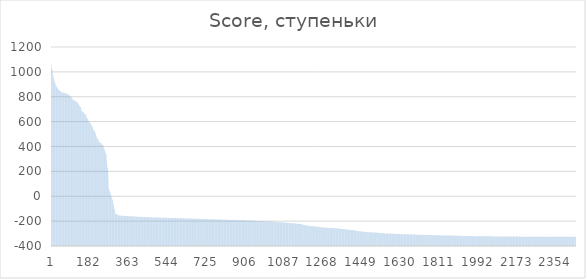
| Category |  Score |
|---|---|
| 0 | 1068.3 |
| 1 | 1045.3 |
| 2 | 1045.3 |
| 3 | 1026 |
| 4 | 1020.4 |
| 5 | 1020.4 |
| 6 | 1016.7 |
| 7 | 1001.3 |
| 8 | 986.9 |
| 9 | 974.9 |
| 10 | 965.9 |
| 11 | 957.7 |
| 12 | 957.7 |
| 13 | 949 |
| 14 | 931.8 |
| 15 | 927.2 |
| 16 | 925.5 |
| 17 | 909.9 |
| 18 | 908.4 |
| 19 | 908.4 |
| 20 | 903.9 |
| 21 | 903.8 |
| 22 | 899.3 |
| 23 | 888.8 |
| 24 | 886 |
| 25 | 884.8 |
| 26 | 874.8 |
| 27 | 874.4 |
| 28 | 874.4 |
| 29 | 874.4 |
| 30 | 867.5 |
| 31 | 865.5 |
| 32 | 864.5 |
| 33 | 858.4 |
| 34 | 856.1 |
| 35 | 856.1 |
| 36 | 856.1 |
| 37 | 854.4 |
| 38 | 851.7 |
| 39 | 849.9 |
| 40 | 848 |
| 41 | 846.7 |
| 42 | 846.1 |
| 43 | 842.8 |
| 44 | 842.8 |
| 45 | 841.3 |
| 46 | 840.3 |
| 47 | 839 |
| 48 | 838.7 |
| 49 | 835.5 |
| 50 | 835.1 |
| 51 | 834.8 |
| 52 | 834.8 |
| 53 | 834 |
| 54 | 833.8 |
| 55 | 833.4 |
| 56 | 832.3 |
| 57 | 832.2 |
| 58 | 832 |
| 59 | 831.9 |
| 60 | 831.8 |
| 61 | 831.1 |
| 62 | 831.1 |
| 63 | 830.5 |
| 64 | 830.1 |
| 65 | 828.3 |
| 66 | 827.8 |
| 67 | 827.5 |
| 68 | 827.5 |
| 69 | 827.5 |
| 70 | 826.8 |
| 71 | 826.2 |
| 72 | 824.3 |
| 73 | 824.3 |
| 74 | 824.3 |
| 75 | 824.2 |
| 76 | 823.1 |
| 77 | 823.1 |
| 78 | 822.6 |
| 79 | 822.6 |
| 80 | 817.3 |
| 81 | 815.6 |
| 82 | 813.9 |
| 83 | 811 |
| 84 | 809.6 |
| 85 | 809.6 |
| 86 | 809.4 |
| 87 | 808.7 |
| 88 | 808.4 |
| 89 | 807.5 |
| 90 | 801.5 |
| 91 | 801.4 |
| 92 | 800.5 |
| 93 | 799.6 |
| 94 | 799.3 |
| 95 | 792.3 |
| 96 | 789.1 |
| 97 | 788.7 |
| 98 | 788.1 |
| 99 | 787.9 |
| 100 | 781.3 |
| 101 | 778 |
| 102 | 776.6 |
| 103 | 776.1 |
| 104 | 774.8 |
| 105 | 774.8 |
| 106 | 774.6 |
| 107 | 772.9 |
| 108 | 770.9 |
| 109 | 770.6 |
| 110 | 769.1 |
| 111 | 767.1 |
| 112 | 766.6 |
| 113 | 766.2 |
| 114 | 765.6 |
| 115 | 763.9 |
| 116 | 760.4 |
| 117 | 759.1 |
| 118 | 758.9 |
| 119 | 758.2 |
| 120 | 758.2 |
| 121 | 757.2 |
| 122 | 754.2 |
| 123 | 754.1 |
| 124 | 748.7 |
| 125 | 748.7 |
| 126 | 746.5 |
| 127 | 745.4 |
| 128 | 744.2 |
| 129 | 740.5 |
| 130 | 736.4 |
| 131 | 730 |
| 132 | 724.7 |
| 133 | 723.2 |
| 134 | 722.5 |
| 135 | 717.6 |
| 136 | 717.4 |
| 137 | 717.3 |
| 138 | 714.9 |
| 139 | 705.1 |
| 140 | 705.1 |
| 141 | 693.6 |
| 142 | 684.6 |
| 143 | 684.6 |
| 144 | 684.6 |
| 145 | 678.8 |
| 146 | 678.8 |
| 147 | 677.8 |
| 148 | 676.9 |
| 149 | 676.3 |
| 150 | 676.2 |
| 151 | 672.1 |
| 152 | 671.6 |
| 153 | 668.4 |
| 154 | 666.9 |
| 155 | 666.9 |
| 156 | 663.7 |
| 157 | 662.2 |
| 158 | 662.2 |
| 159 | 659.4 |
| 160 | 658 |
| 161 | 655.8 |
| 162 | 654.9 |
| 163 | 654.3 |
| 164 | 650 |
| 165 | 635.3 |
| 166 | 631.5 |
| 167 | 630.8 |
| 168 | 630.2 |
| 169 | 626.3 |
| 170 | 623.8 |
| 171 | 622 |
| 172 | 618.1 |
| 173 | 615.3 |
| 174 | 605.3 |
| 175 | 605.3 |
| 176 | 604.8 |
| 177 | 599.4 |
| 178 | 596.2 |
| 179 | 591.2 |
| 180 | 589.1 |
| 181 | 586.8 |
| 182 | 586.4 |
| 183 | 586.4 |
| 184 | 585.6 |
| 185 | 585 |
| 186 | 583.6 |
| 187 | 576.3 |
| 188 | 572.5 |
| 189 | 569.1 |
| 190 | 564.5 |
| 191 | 558.9 |
| 192 | 558.7 |
| 193 | 557.1 |
| 194 | 556 |
| 195 | 547 |
| 196 | 536.5 |
| 197 | 535.8 |
| 198 | 535.8 |
| 199 | 533.5 |
| 200 | 532.5 |
| 201 | 530.9 |
| 202 | 526.7 |
| 203 | 520.2 |
| 204 | 518.5 |
| 205 | 515.1 |
| 206 | 510.4 |
| 207 | 508.6 |
| 208 | 501.3 |
| 209 | 493.6 |
| 210 | 488.4 |
| 211 | 487.8 |
| 212 | 472.9 |
| 213 | 471.2 |
| 214 | 470.2 |
| 215 | 467.7 |
| 216 | 467.5 |
| 217 | 463.9 |
| 218 | 458.5 |
| 219 | 457.2 |
| 220 | 456.5 |
| 221 | 447.6 |
| 222 | 444.8 |
| 223 | 442.6 |
| 224 | 437.9 |
| 225 | 435.9 |
| 226 | 431.6 |
| 227 | 431 |
| 228 | 429.2 |
| 229 | 428.9 |
| 230 | 428.5 |
| 231 | 428 |
| 232 | 426.7 |
| 233 | 426.7 |
| 234 | 425.7 |
| 235 | 424.5 |
| 236 | 422.2 |
| 237 | 417.8 |
| 238 | 415.2 |
| 239 | 412.7 |
| 240 | 411.6 |
| 241 | 411.2 |
| 242 | 411.2 |
| 243 | 410 |
| 244 | 396.2 |
| 245 | 391.4 |
| 246 | 388.6 |
| 247 | 382.4 |
| 248 | 382.4 |
| 249 | 379.2 |
| 250 | 367.2 |
| 251 | 364.5 |
| 252 | 362.6 |
| 253 | 361.1 |
| 254 | 342.3 |
| 255 | 340.5 |
| 256 | 339.1 |
| 257 | 338.4 |
| 258 | 337.6 |
| 259 | 289.9 |
| 260 | 276.2 |
| 261 | 241.1 |
| 262 | 240.1 |
| 263 | 227.3 |
| 264 | 223.8 |
| 265 | 215.9 |
| 266 | 196.5 |
| 267 | 140.6 |
| 268 | 83.1 |
| 269 | 64.9 |
| 270 | 58.5 |
| 271 | 46.3 |
| 272 | 44.8 |
| 273 | 41.5 |
| 274 | 35.5 |
| 275 | 30 |
| 276 | 28.7 |
| 277 | 21.6 |
| 278 | 7.8 |
| 279 | 4.1 |
| 280 | 4.1 |
| 281 | -1 |
| 282 | -8.5 |
| 283 | -9.8 |
| 284 | -20.5 |
| 285 | -21.8 |
| 286 | -29.4 |
| 287 | -35.5 |
| 288 | -38.3 |
| 289 | -42.9 |
| 290 | -56.4 |
| 291 | -63.3 |
| 292 | -76.3 |
| 293 | -83.2 |
| 294 | -95.1 |
| 295 | -104.9 |
| 296 | -106.8 |
| 297 | -107.3 |
| 298 | -136 |
| 299 | -136 |
| 300 | -136.1 |
| 301 | -139.2 |
| 302 | -139.3 |
| 303 | -142.1 |
| 304 | -142.5 |
| 305 | -142.7 |
| 306 | -144.9 |
| 307 | -146.6 |
| 308 | -146.7 |
| 309 | -148 |
| 310 | -149.9 |
| 311 | -149.9 |
| 312 | -150.3 |
| 313 | -150.7 |
| 314 | -153.1 |
| 315 | -153.8 |
| 316 | -153.8 |
| 317 | -154.1 |
| 318 | -154.3 |
| 319 | -154.3 |
| 320 | -155 |
| 321 | -155.1 |
| 322 | -156.1 |
| 323 | -156.2 |
| 324 | -156.2 |
| 325 | -156.2 |
| 326 | -156.2 |
| 327 | -156.2 |
| 328 | -156.4 |
| 329 | -156.4 |
| 330 | -156.4 |
| 331 | -156.6 |
| 332 | -157.1 |
| 333 | -157.1 |
| 334 | -157.1 |
| 335 | -157.6 |
| 336 | -157.7 |
| 337 | -157.7 |
| 338 | -157.8 |
| 339 | -157.8 |
| 340 | -158.1 |
| 341 | -158.1 |
| 342 | -158.1 |
| 343 | -158.1 |
| 344 | -158.1 |
| 345 | -158.2 |
| 346 | -158.3 |
| 347 | -158.4 |
| 348 | -158.7 |
| 349 | -158.8 |
| 350 | -158.9 |
| 351 | -159.2 |
| 352 | -159.4 |
| 353 | -159.4 |
| 354 | -159.7 |
| 355 | -159.7 |
| 356 | -159.7 |
| 357 | -159.7 |
| 358 | -159.7 |
| 359 | -159.8 |
| 360 | -159.8 |
| 361 | -159.9 |
| 362 | -160 |
| 363 | -160.2 |
| 364 | -160.3 |
| 365 | -160.9 |
| 366 | -161.1 |
| 367 | -161.1 |
| 368 | -161.1 |
| 369 | -161.1 |
| 370 | -161.3 |
| 371 | -161.3 |
| 372 | -161.3 |
| 373 | -161.4 |
| 374 | -161.5 |
| 375 | -161.5 |
| 376 | -161.7 |
| 377 | -161.9 |
| 378 | -162 |
| 379 | -162.3 |
| 380 | -162.3 |
| 381 | -162.4 |
| 382 | -162.8 |
| 383 | -162.8 |
| 384 | -162.9 |
| 385 | -163 |
| 386 | -163.2 |
| 387 | -163.3 |
| 388 | -163.4 |
| 389 | -163.4 |
| 390 | -163.5 |
| 391 | -163.5 |
| 392 | -163.5 |
| 393 | -163.6 |
| 394 | -163.6 |
| 395 | -163.7 |
| 396 | -164 |
| 397 | -164 |
| 398 | -164 |
| 399 | -164.1 |
| 400 | -164.1 |
| 401 | -164.1 |
| 402 | -164.1 |
| 403 | -164.2 |
| 404 | -164.2 |
| 405 | -164.5 |
| 406 | -164.5 |
| 407 | -164.6 |
| 408 | -164.7 |
| 409 | -164.9 |
| 410 | -164.9 |
| 411 | -165 |
| 412 | -165 |
| 413 | -165 |
| 414 | -165.1 |
| 415 | -165.2 |
| 416 | -165.2 |
| 417 | -165.2 |
| 418 | -165.3 |
| 419 | -165.3 |
| 420 | -165.3 |
| 421 | -165.4 |
| 422 | -165.5 |
| 423 | -165.6 |
| 424 | -165.9 |
| 425 | -165.9 |
| 426 | -165.9 |
| 427 | -166 |
| 428 | -166.2 |
| 429 | -166.2 |
| 430 | -166.3 |
| 431 | -166.3 |
| 432 | -166.3 |
| 433 | -166.3 |
| 434 | -166.4 |
| 435 | -166.4 |
| 436 | -166.4 |
| 437 | -166.5 |
| 438 | -166.5 |
| 439 | -166.5 |
| 440 | -166.5 |
| 441 | -166.5 |
| 442 | -166.5 |
| 443 | -166.5 |
| 444 | -166.5 |
| 445 | -166.6 |
| 446 | -166.6 |
| 447 | -166.8 |
| 448 | -166.8 |
| 449 | -167 |
| 450 | -167 |
| 451 | -167.1 |
| 452 | -167.1 |
| 453 | -167.2 |
| 454 | -167.2 |
| 455 | -167.2 |
| 456 | -167.7 |
| 457 | -167.7 |
| 458 | -168 |
| 459 | -168.1 |
| 460 | -168.2 |
| 461 | -168.3 |
| 462 | -168.3 |
| 463 | -168.5 |
| 464 | -168.7 |
| 465 | -168.8 |
| 466 | -168.9 |
| 467 | -168.9 |
| 468 | -169.3 |
| 469 | -169.4 |
| 470 | -169.7 |
| 471 | -169.7 |
| 472 | -169.7 |
| 473 | -169.9 |
| 474 | -169.9 |
| 475 | -170.1 |
| 476 | -170.1 |
| 477 | -170.2 |
| 478 | -170.2 |
| 479 | -170.4 |
| 480 | -170.4 |
| 481 | -170.4 |
| 482 | -170.5 |
| 483 | -170.5 |
| 484 | -170.5 |
| 485 | -170.6 |
| 486 | -170.9 |
| 487 | -170.9 |
| 488 | -171.1 |
| 489 | -171.1 |
| 490 | -171.1 |
| 491 | -171.2 |
| 492 | -171.2 |
| 493 | -171.3 |
| 494 | -171.3 |
| 495 | -171.3 |
| 496 | -171.4 |
| 497 | -171.5 |
| 498 | -171.5 |
| 499 | -171.5 |
| 500 | -171.6 |
| 501 | -171.7 |
| 502 | -171.9 |
| 503 | -171.9 |
| 504 | -172 |
| 505 | -172.1 |
| 506 | -172.2 |
| 507 | -172.3 |
| 508 | -172.3 |
| 509 | -172.3 |
| 510 | -172.3 |
| 511 | -172.4 |
| 512 | -172.4 |
| 513 | -172.5 |
| 514 | -172.5 |
| 515 | -172.6 |
| 516 | -172.6 |
| 517 | -172.7 |
| 518 | -172.8 |
| 519 | -172.8 |
| 520 | -172.8 |
| 521 | -172.9 |
| 522 | -172.9 |
| 523 | -172.9 |
| 524 | -173 |
| 525 | -173 |
| 526 | -173 |
| 527 | -173 |
| 528 | -173.2 |
| 529 | -173.3 |
| 530 | -173.3 |
| 531 | -173.4 |
| 532 | -173.4 |
| 533 | -173.5 |
| 534 | -173.5 |
| 535 | -173.5 |
| 536 | -173.5 |
| 537 | -173.6 |
| 538 | -173.6 |
| 539 | -173.6 |
| 540 | -173.7 |
| 541 | -173.7 |
| 542 | -173.9 |
| 543 | -174 |
| 544 | -174.1 |
| 545 | -174.1 |
| 546 | -174.1 |
| 547 | -174.2 |
| 548 | -174.3 |
| 549 | -174.3 |
| 550 | -174.3 |
| 551 | -174.4 |
| 552 | -174.4 |
| 553 | -174.4 |
| 554 | -174.4 |
| 555 | -174.5 |
| 556 | -174.5 |
| 557 | -174.5 |
| 558 | -174.5 |
| 559 | -174.6 |
| 560 | -174.6 |
| 561 | -174.8 |
| 562 | -174.8 |
| 563 | -174.8 |
| 564 | -174.8 |
| 565 | -174.9 |
| 566 | -175 |
| 567 | -175 |
| 568 | -175 |
| 569 | -175 |
| 570 | -175 |
| 571 | -175.1 |
| 572 | -175.3 |
| 573 | -175.3 |
| 574 | -175.4 |
| 575 | -175.4 |
| 576 | -175.4 |
| 577 | -175.4 |
| 578 | -175.5 |
| 579 | -175.5 |
| 580 | -175.5 |
| 581 | -175.5 |
| 582 | -175.5 |
| 583 | -175.5 |
| 584 | -175.5 |
| 585 | -175.5 |
| 586 | -175.5 |
| 587 | -175.5 |
| 588 | -175.6 |
| 589 | -175.6 |
| 590 | -175.7 |
| 591 | -175.7 |
| 592 | -175.7 |
| 593 | -175.7 |
| 594 | -175.8 |
| 595 | -175.9 |
| 596 | -175.9 |
| 597 | -176 |
| 598 | -176.2 |
| 599 | -176.3 |
| 600 | -176.3 |
| 601 | -176.4 |
| 602 | -176.4 |
| 603 | -176.5 |
| 604 | -176.6 |
| 605 | -176.7 |
| 606 | -176.7 |
| 607 | -176.7 |
| 608 | -176.7 |
| 609 | -176.8 |
| 610 | -176.9 |
| 611 | -176.9 |
| 612 | -176.9 |
| 613 | -177 |
| 614 | -177.1 |
| 615 | -177.1 |
| 616 | -177.2 |
| 617 | -177.3 |
| 618 | -177.4 |
| 619 | -177.7 |
| 620 | -177.7 |
| 621 | -177.8 |
| 622 | -177.8 |
| 623 | -177.8 |
| 624 | -177.9 |
| 625 | -177.9 |
| 626 | -177.9 |
| 627 | -177.9 |
| 628 | -178 |
| 629 | -178.1 |
| 630 | -178.1 |
| 631 | -178.1 |
| 632 | -178.1 |
| 633 | -178.1 |
| 634 | -178.4 |
| 635 | -178.5 |
| 636 | -178.6 |
| 637 | -178.7 |
| 638 | -178.7 |
| 639 | -178.8 |
| 640 | -178.8 |
| 641 | -178.8 |
| 642 | -178.9 |
| 643 | -179 |
| 644 | -179 |
| 645 | -179 |
| 646 | -179.2 |
| 647 | -179.4 |
| 648 | -179.5 |
| 649 | -179.5 |
| 650 | -179.6 |
| 651 | -179.6 |
| 652 | -179.6 |
| 653 | -179.6 |
| 654 | -179.6 |
| 655 | -179.6 |
| 656 | -179.7 |
| 657 | -179.8 |
| 658 | -179.9 |
| 659 | -179.9 |
| 660 | -179.9 |
| 661 | -180.1 |
| 662 | -180.1 |
| 663 | -180.1 |
| 664 | -180.3 |
| 665 | -180.3 |
| 666 | -180.5 |
| 667 | -180.5 |
| 668 | -180.5 |
| 669 | -180.6 |
| 670 | -180.6 |
| 671 | -180.6 |
| 672 | -180.6 |
| 673 | -180.7 |
| 674 | -180.8 |
| 675 | -180.9 |
| 676 | -180.9 |
| 677 | -181 |
| 678 | -181 |
| 679 | -181.1 |
| 680 | -181.1 |
| 681 | -181.2 |
| 682 | -181.2 |
| 683 | -181.3 |
| 684 | -181.3 |
| 685 | -181.4 |
| 686 | -181.4 |
| 687 | -181.4 |
| 688 | -181.4 |
| 689 | -181.4 |
| 690 | -181.5 |
| 691 | -181.5 |
| 692 | -181.6 |
| 693 | -181.8 |
| 694 | -182 |
| 695 | -182.1 |
| 696 | -182.1 |
| 697 | -182.1 |
| 698 | -182.2 |
| 699 | -182.3 |
| 700 | -182.3 |
| 701 | -182.4 |
| 702 | -182.4 |
| 703 | -182.5 |
| 704 | -182.6 |
| 705 | -182.7 |
| 706 | -182.7 |
| 707 | -182.8 |
| 708 | -183 |
| 709 | -183 |
| 710 | -183 |
| 711 | -183.2 |
| 712 | -183.2 |
| 713 | -183.4 |
| 714 | -183.4 |
| 715 | -183.4 |
| 716 | -183.4 |
| 717 | -183.4 |
| 718 | -183.4 |
| 719 | -183.4 |
| 720 | -183.5 |
| 721 | -183.5 |
| 722 | -183.6 |
| 723 | -183.8 |
| 724 | -183.8 |
| 725 | -183.9 |
| 726 | -184 |
| 727 | -184.2 |
| 728 | -184.2 |
| 729 | -184.2 |
| 730 | -184.2 |
| 731 | -184.2 |
| 732 | -184.2 |
| 733 | -184.3 |
| 734 | -184.4 |
| 735 | -184.4 |
| 736 | -184.4 |
| 737 | -184.4 |
| 738 | -184.4 |
| 739 | -184.4 |
| 740 | -184.6 |
| 741 | -184.6 |
| 742 | -184.7 |
| 743 | -184.7 |
| 744 | -184.8 |
| 745 | -184.8 |
| 746 | -184.9 |
| 747 | -184.9 |
| 748 | -184.9 |
| 749 | -184.9 |
| 750 | -185.1 |
| 751 | -185.1 |
| 752 | -185.1 |
| 753 | -185.2 |
| 754 | -185.4 |
| 755 | -185.6 |
| 756 | -185.6 |
| 757 | -185.6 |
| 758 | -185.7 |
| 759 | -185.7 |
| 760 | -185.7 |
| 761 | -185.7 |
| 762 | -185.7 |
| 763 | -186.1 |
| 764 | -186.1 |
| 765 | -186.2 |
| 766 | -186.2 |
| 767 | -186.3 |
| 768 | -186.3 |
| 769 | -186.4 |
| 770 | -186.4 |
| 771 | -186.4 |
| 772 | -186.6 |
| 773 | -186.7 |
| 774 | -186.8 |
| 775 | -186.8 |
| 776 | -186.8 |
| 777 | -186.8 |
| 778 | -186.8 |
| 779 | -186.8 |
| 780 | -186.8 |
| 781 | -186.9 |
| 782 | -187 |
| 783 | -187.2 |
| 784 | -187.2 |
| 785 | -187.2 |
| 786 | -187.3 |
| 787 | -187.3 |
| 788 | -187.4 |
| 789 | -187.4 |
| 790 | -187.6 |
| 791 | -187.7 |
| 792 | -187.9 |
| 793 | -187.9 |
| 794 | -188.3 |
| 795 | -188.3 |
| 796 | -188.3 |
| 797 | -188.4 |
| 798 | -188.4 |
| 799 | -188.4 |
| 800 | -188.5 |
| 801 | -188.5 |
| 802 | -188.5 |
| 803 | -188.5 |
| 804 | -188.5 |
| 805 | -188.7 |
| 806 | -188.7 |
| 807 | -188.7 |
| 808 | -188.7 |
| 809 | -188.8 |
| 810 | -189 |
| 811 | -189 |
| 812 | -189 |
| 813 | -189.2 |
| 814 | -189.2 |
| 815 | -189.2 |
| 816 | -189.4 |
| 817 | -189.5 |
| 818 | -189.5 |
| 819 | -189.6 |
| 820 | -189.8 |
| 821 | -189.9 |
| 822 | -189.9 |
| 823 | -189.9 |
| 824 | -189.9 |
| 825 | -190.1 |
| 826 | -190.1 |
| 827 | -190.2 |
| 828 | -190.2 |
| 829 | -190.2 |
| 830 | -190.2 |
| 831 | -190.3 |
| 832 | -190.3 |
| 833 | -190.3 |
| 834 | -190.3 |
| 835 | -190.4 |
| 836 | -190.4 |
| 837 | -190.5 |
| 838 | -190.6 |
| 839 | -190.6 |
| 840 | -190.6 |
| 841 | -190.7 |
| 842 | -190.7 |
| 843 | -190.9 |
| 844 | -190.9 |
| 845 | -190.9 |
| 846 | -191 |
| 847 | -191.1 |
| 848 | -191.2 |
| 849 | -191.2 |
| 850 | -191.5 |
| 851 | -191.5 |
| 852 | -191.6 |
| 853 | -191.6 |
| 854 | -191.7 |
| 855 | -191.7 |
| 856 | -191.7 |
| 857 | -191.8 |
| 858 | -191.8 |
| 859 | -191.8 |
| 860 | -191.8 |
| 861 | -191.8 |
| 862 | -192.1 |
| 863 | -192.1 |
| 864 | -192.1 |
| 865 | -192.1 |
| 866 | -192.1 |
| 867 | -192.1 |
| 868 | -192.2 |
| 869 | -192.2 |
| 870 | -192.3 |
| 871 | -192.3 |
| 872 | -192.3 |
| 873 | -192.4 |
| 874 | -192.4 |
| 875 | -192.5 |
| 876 | -192.6 |
| 877 | -192.6 |
| 878 | -192.8 |
| 879 | -192.9 |
| 880 | -192.9 |
| 881 | -192.9 |
| 882 | -192.9 |
| 883 | -193 |
| 884 | -193.1 |
| 885 | -193.1 |
| 886 | -193.1 |
| 887 | -193.2 |
| 888 | -193.2 |
| 889 | -193.3 |
| 890 | -193.3 |
| 891 | -193.5 |
| 892 | -193.5 |
| 893 | -193.5 |
| 894 | -193.5 |
| 895 | -193.5 |
| 896 | -193.6 |
| 897 | -193.7 |
| 898 | -193.7 |
| 899 | -193.7 |
| 900 | -193.8 |
| 901 | -193.8 |
| 902 | -193.8 |
| 903 | -193.8 |
| 904 | -193.8 |
| 905 | -193.8 |
| 906 | -194 |
| 907 | -194 |
| 908 | -194.1 |
| 909 | -194.1 |
| 910 | -194.1 |
| 911 | -194.1 |
| 912 | -194.2 |
| 913 | -194.2 |
| 914 | -194.4 |
| 915 | -194.4 |
| 916 | -194.4 |
| 917 | -194.5 |
| 918 | -194.5 |
| 919 | -194.7 |
| 920 | -194.8 |
| 921 | -195 |
| 922 | -195.2 |
| 923 | -195.2 |
| 924 | -195.2 |
| 925 | -195.3 |
| 926 | -195.4 |
| 927 | -195.4 |
| 928 | -195.4 |
| 929 | -195.5 |
| 930 | -195.6 |
| 931 | -195.6 |
| 932 | -195.6 |
| 933 | -195.7 |
| 934 | -195.8 |
| 935 | -196 |
| 936 | -196.2 |
| 937 | -196.4 |
| 938 | -196.4 |
| 939 | -196.5 |
| 940 | -196.6 |
| 941 | -196.6 |
| 942 | -196.7 |
| 943 | -196.7 |
| 944 | -196.8 |
| 945 | -196.8 |
| 946 | -196.9 |
| 947 | -196.9 |
| 948 | -197 |
| 949 | -197.1 |
| 950 | -197.1 |
| 951 | -197.3 |
| 952 | -197.7 |
| 953 | -197.8 |
| 954 | -197.9 |
| 955 | -198 |
| 956 | -198 |
| 957 | -198.2 |
| 958 | -198.2 |
| 959 | -198.3 |
| 960 | -198.3 |
| 961 | -198.7 |
| 962 | -198.7 |
| 963 | -198.9 |
| 964 | -199 |
| 965 | -199 |
| 966 | -199.2 |
| 967 | -199.3 |
| 968 | -199.3 |
| 969 | -199.4 |
| 970 | -199.5 |
| 971 | -199.5 |
| 972 | -199.7 |
| 973 | -199.8 |
| 974 | -199.9 |
| 975 | -199.9 |
| 976 | -199.9 |
| 977 | -200 |
| 978 | -200 |
| 979 | -200 |
| 980 | -200 |
| 981 | -200 |
| 982 | -200 |
| 983 | -200.1 |
| 984 | -200.2 |
| 985 | -200.2 |
| 986 | -200.5 |
| 987 | -200.5 |
| 988 | -200.6 |
| 989 | -200.7 |
| 990 | -200.7 |
| 991 | -200.8 |
| 992 | -201.3 |
| 993 | -201.5 |
| 994 | -201.8 |
| 995 | -201.8 |
| 996 | -202 |
| 997 | -202.1 |
| 998 | -202.2 |
| 999 | -202.2 |
| 1000 | -202.2 |
| 1001 | -202.2 |
| 1002 | -202.2 |
| 1003 | -202.2 |
| 1004 | -202.2 |
| 1005 | -202.3 |
| 1006 | -202.5 |
| 1007 | -202.7 |
| 1008 | -202.7 |
| 1009 | -202.7 |
| 1010 | -203 |
| 1011 | -203 |
| 1012 | -203 |
| 1013 | -203.1 |
| 1014 | -203.1 |
| 1015 | -203.2 |
| 1016 | -203.2 |
| 1017 | -203.3 |
| 1018 | -203.4 |
| 1019 | -203.4 |
| 1020 | -203.6 |
| 1021 | -203.7 |
| 1022 | -203.9 |
| 1023 | -203.9 |
| 1024 | -203.9 |
| 1025 | -204.2 |
| 1026 | -204.2 |
| 1027 | -204.3 |
| 1028 | -204.4 |
| 1029 | -204.7 |
| 1030 | -204.9 |
| 1031 | -205 |
| 1032 | -205.2 |
| 1033 | -205.3 |
| 1034 | -205.5 |
| 1035 | -205.6 |
| 1036 | -205.6 |
| 1037 | -205.7 |
| 1038 | -205.9 |
| 1039 | -206.2 |
| 1040 | -206.5 |
| 1041 | -206.6 |
| 1042 | -206.8 |
| 1043 | -206.8 |
| 1044 | -206.8 |
| 1045 | -206.8 |
| 1046 | -206.9 |
| 1047 | -207 |
| 1048 | -207 |
| 1049 | -207 |
| 1050 | -207.3 |
| 1051 | -207.3 |
| 1052 | -207.4 |
| 1053 | -207.4 |
| 1054 | -207.6 |
| 1055 | -207.8 |
| 1056 | -207.9 |
| 1057 | -207.9 |
| 1058 | -208 |
| 1059 | -208 |
| 1060 | -208.1 |
| 1061 | -208.2 |
| 1062 | -208.4 |
| 1063 | -208.6 |
| 1064 | -208.9 |
| 1065 | -209 |
| 1066 | -209.1 |
| 1067 | -209.1 |
| 1068 | -209.1 |
| 1069 | -209.1 |
| 1070 | -209.2 |
| 1071 | -209.5 |
| 1072 | -209.5 |
| 1073 | -209.6 |
| 1074 | -209.7 |
| 1075 | -210 |
| 1076 | -210.3 |
| 1077 | -210.4 |
| 1078 | -210.7 |
| 1079 | -210.7 |
| 1080 | -210.8 |
| 1081 | -210.8 |
| 1082 | -210.8 |
| 1083 | -211.3 |
| 1084 | -211.4 |
| 1085 | -211.6 |
| 1086 | -211.6 |
| 1087 | -211.8 |
| 1088 | -212.3 |
| 1089 | -212.9 |
| 1090 | -212.9 |
| 1091 | -213.1 |
| 1092 | -213.2 |
| 1093 | -213.2 |
| 1094 | -213.2 |
| 1095 | -213.2 |
| 1096 | -213.2 |
| 1097 | -213.2 |
| 1098 | -213.4 |
| 1099 | -213.4 |
| 1100 | -213.4 |
| 1101 | -213.4 |
| 1102 | -213.4 |
| 1103 | -214.3 |
| 1104 | -214.3 |
| 1105 | -214.3 |
| 1106 | -214.3 |
| 1107 | -214.3 |
| 1108 | -214.3 |
| 1109 | -214.9 |
| 1110 | -215 |
| 1111 | -215.4 |
| 1112 | -215.4 |
| 1113 | -215.6 |
| 1114 | -216 |
| 1115 | -216.1 |
| 1116 | -216.1 |
| 1117 | -216.3 |
| 1118 | -216.5 |
| 1119 | -216.6 |
| 1120 | -216.6 |
| 1121 | -217 |
| 1122 | -217.1 |
| 1123 | -217.2 |
| 1124 | -217.6 |
| 1125 | -217.7 |
| 1126 | -217.8 |
| 1127 | -217.8 |
| 1128 | -217.9 |
| 1129 | -218 |
| 1130 | -218.1 |
| 1131 | -218.1 |
| 1132 | -218.7 |
| 1133 | -218.7 |
| 1134 | -218.8 |
| 1135 | -218.8 |
| 1136 | -219.2 |
| 1137 | -219.4 |
| 1138 | -219.5 |
| 1139 | -219.5 |
| 1140 | -219.9 |
| 1141 | -220 |
| 1142 | -220.2 |
| 1143 | -220.2 |
| 1144 | -220.4 |
| 1145 | -220.5 |
| 1146 | -220.5 |
| 1147 | -220.7 |
| 1148 | -220.7 |
| 1149 | -220.9 |
| 1150 | -220.9 |
| 1151 | -221.1 |
| 1152 | -221.1 |
| 1153 | -221.2 |
| 1154 | -221.2 |
| 1155 | -221.9 |
| 1156 | -222.1 |
| 1157 | -222.2 |
| 1158 | -222.3 |
| 1159 | -222.5 |
| 1160 | -222.6 |
| 1161 | -222.7 |
| 1162 | -222.8 |
| 1163 | -223.6 |
| 1164 | -223.7 |
| 1165 | -224.4 |
| 1166 | -224.5 |
| 1167 | -225.2 |
| 1168 | -225.2 |
| 1169 | -225.2 |
| 1170 | -227 |
| 1171 | -228.3 |
| 1172 | -228.4 |
| 1173 | -228.7 |
| 1174 | -228.8 |
| 1175 | -229.2 |
| 1176 | -229.6 |
| 1177 | -230 |
| 1178 | -230.9 |
| 1179 | -231 |
| 1180 | -232.1 |
| 1181 | -232.1 |
| 1182 | -232.8 |
| 1183 | -232.9 |
| 1184 | -232.9 |
| 1185 | -233.3 |
| 1186 | -233.4 |
| 1187 | -233.6 |
| 1188 | -234.1 |
| 1189 | -234.9 |
| 1190 | -235 |
| 1191 | -235.3 |
| 1192 | -235.8 |
| 1193 | -236.1 |
| 1194 | -236.5 |
| 1195 | -236.6 |
| 1196 | -236.6 |
| 1197 | -236.7 |
| 1198 | -237 |
| 1199 | -237.1 |
| 1200 | -238 |
| 1201 | -238.4 |
| 1202 | -238.5 |
| 1203 | -238.7 |
| 1204 | -238.8 |
| 1205 | -238.8 |
| 1206 | -238.8 |
| 1207 | -238.8 |
| 1208 | -239 |
| 1209 | -239 |
| 1210 | -240.3 |
| 1211 | -240.4 |
| 1212 | -240.5 |
| 1213 | -240.5 |
| 1214 | -240.7 |
| 1215 | -240.9 |
| 1216 | -240.9 |
| 1217 | -241 |
| 1218 | -241.5 |
| 1219 | -241.8 |
| 1220 | -242.2 |
| 1221 | -242.2 |
| 1222 | -242.2 |
| 1223 | -242.2 |
| 1224 | -242.2 |
| 1225 | -242.6 |
| 1226 | -242.8 |
| 1227 | -242.9 |
| 1228 | -242.9 |
| 1229 | -243 |
| 1230 | -243.3 |
| 1231 | -243.6 |
| 1232 | -243.8 |
| 1233 | -244 |
| 1234 | -244 |
| 1235 | -244 |
| 1236 | -244 |
| 1237 | -244.1 |
| 1238 | -244.2 |
| 1239 | -244.5 |
| 1240 | -245.4 |
| 1241 | -245.8 |
| 1242 | -245.8 |
| 1243 | -245.8 |
| 1244 | -245.9 |
| 1245 | -245.9 |
| 1246 | -246.3 |
| 1247 | -246.5 |
| 1248 | -246.7 |
| 1249 | -246.8 |
| 1250 | -247.1 |
| 1251 | -247.5 |
| 1252 | -247.6 |
| 1253 | -247.6 |
| 1254 | -247.8 |
| 1255 | -247.9 |
| 1256 | -248 |
| 1257 | -248.4 |
| 1258 | -248.4 |
| 1259 | -248.5 |
| 1260 | -248.7 |
| 1261 | -248.8 |
| 1262 | -249.1 |
| 1263 | -249.4 |
| 1264 | -249.5 |
| 1265 | -250.4 |
| 1266 | -250.4 |
| 1267 | -250.4 |
| 1268 | -250.5 |
| 1269 | -250.6 |
| 1270 | -250.7 |
| 1271 | -250.8 |
| 1272 | -250.8 |
| 1273 | -251.6 |
| 1274 | -251.9 |
| 1275 | -251.9 |
| 1276 | -252.2 |
| 1277 | -252.4 |
| 1278 | -252.4 |
| 1279 | -252.5 |
| 1280 | -252.8 |
| 1281 | -252.9 |
| 1282 | -252.9 |
| 1283 | -252.9 |
| 1284 | -252.9 |
| 1285 | -253.2 |
| 1286 | -253.2 |
| 1287 | -253.6 |
| 1288 | -254.2 |
| 1289 | -254.2 |
| 1290 | -254.2 |
| 1291 | -254.2 |
| 1292 | -254.4 |
| 1293 | -254.5 |
| 1294 | -254.5 |
| 1295 | -254.5 |
| 1296 | -254.7 |
| 1297 | -254.8 |
| 1298 | -254.8 |
| 1299 | -254.8 |
| 1300 | -254.8 |
| 1301 | -254.8 |
| 1302 | -254.8 |
| 1303 | -255 |
| 1304 | -255.1 |
| 1305 | -255.2 |
| 1306 | -255.3 |
| 1307 | -255.5 |
| 1308 | -255.5 |
| 1309 | -255.9 |
| 1310 | -256.1 |
| 1311 | -256.1 |
| 1312 | -256.1 |
| 1313 | -256.2 |
| 1314 | -256.5 |
| 1315 | -256.5 |
| 1316 | -256.7 |
| 1317 | -257.3 |
| 1318 | -257.5 |
| 1319 | -257.7 |
| 1320 | -257.9 |
| 1321 | -258.1 |
| 1322 | -258.2 |
| 1323 | -258.5 |
| 1324 | -258.6 |
| 1325 | -258.7 |
| 1326 | -258.8 |
| 1327 | -258.9 |
| 1328 | -258.9 |
| 1329 | -258.9 |
| 1330 | -259 |
| 1331 | -259 |
| 1332 | -259 |
| 1333 | -259 |
| 1334 | -259 |
| 1335 | -259.2 |
| 1336 | -259.3 |
| 1337 | -259.3 |
| 1338 | -259.4 |
| 1339 | -259.4 |
| 1340 | -259.8 |
| 1341 | -259.8 |
| 1342 | -259.8 |
| 1343 | -260 |
| 1344 | -260.3 |
| 1345 | -260.8 |
| 1346 | -260.8 |
| 1347 | -260.8 |
| 1348 | -260.8 |
| 1349 | -260.9 |
| 1350 | -262.4 |
| 1351 | -262.5 |
| 1352 | -262.5 |
| 1353 | -262.8 |
| 1354 | -263 |
| 1355 | -263 |
| 1356 | -263 |
| 1357 | -263 |
| 1358 | -263 |
| 1359 | -263 |
| 1360 | -263 |
| 1361 | -263 |
| 1362 | -263.4 |
| 1363 | -263.4 |
| 1364 | -263.4 |
| 1365 | -263.5 |
| 1366 | -263.8 |
| 1367 | -263.8 |
| 1368 | -264.2 |
| 1369 | -264.6 |
| 1370 | -265.6 |
| 1371 | -265.8 |
| 1372 | -265.9 |
| 1373 | -266.4 |
| 1374 | -266.4 |
| 1375 | -266.4 |
| 1376 | -266.8 |
| 1377 | -267.2 |
| 1378 | -267.3 |
| 1379 | -267.4 |
| 1380 | -268.1 |
| 1381 | -268.5 |
| 1382 | -268.6 |
| 1383 | -268.7 |
| 1384 | -268.9 |
| 1385 | -269.1 |
| 1386 | -269.2 |
| 1387 | -269.3 |
| 1388 | -269.4 |
| 1389 | -270 |
| 1390 | -270.3 |
| 1391 | -270.8 |
| 1392 | -270.9 |
| 1393 | -270.9 |
| 1394 | -270.9 |
| 1395 | -271.1 |
| 1396 | -271.1 |
| 1397 | -271.3 |
| 1398 | -271.5 |
| 1399 | -271.6 |
| 1400 | -271.7 |
| 1401 | -271.7 |
| 1402 | -271.9 |
| 1403 | -272.1 |
| 1404 | -272.1 |
| 1405 | -272.5 |
| 1406 | -272.6 |
| 1407 | -272.8 |
| 1408 | -273.1 |
| 1409 | -273.4 |
| 1410 | -273.5 |
| 1411 | -273.5 |
| 1412 | -274.1 |
| 1413 | -274.1 |
| 1414 | -274.9 |
| 1415 | -275.2 |
| 1416 | -275.6 |
| 1417 | -275.6 |
| 1418 | -275.8 |
| 1419 | -276.1 |
| 1420 | -276.9 |
| 1421 | -277.5 |
| 1422 | -277.5 |
| 1423 | -277.6 |
| 1424 | -277.9 |
| 1425 | -279.3 |
| 1426 | -279.4 |
| 1427 | -279.5 |
| 1428 | -279.6 |
| 1429 | -279.7 |
| 1430 | -280.1 |
| 1431 | -280.4 |
| 1432 | -281 |
| 1433 | -281 |
| 1434 | -281.1 |
| 1435 | -281.2 |
| 1436 | -281.7 |
| 1437 | -281.8 |
| 1438 | -281.9 |
| 1439 | -281.9 |
| 1440 | -282 |
| 1441 | -282.1 |
| 1442 | -282.3 |
| 1443 | -282.4 |
| 1444 | -282.6 |
| 1445 | -283.2 |
| 1446 | -283.4 |
| 1447 | -283.5 |
| 1448 | -283.9 |
| 1449 | -284 |
| 1450 | -284.1 |
| 1451 | -284.3 |
| 1452 | -285 |
| 1453 | -285.1 |
| 1454 | -285.2 |
| 1455 | -285.8 |
| 1456 | -286.1 |
| 1457 | -286.1 |
| 1458 | -286.2 |
| 1459 | -286.3 |
| 1460 | -286.9 |
| 1461 | -287 |
| 1462 | -287 |
| 1463 | -287.1 |
| 1464 | -287.1 |
| 1465 | -287.1 |
| 1466 | -287.1 |
| 1467 | -287.2 |
| 1468 | -287.3 |
| 1469 | -287.3 |
| 1470 | -287.6 |
| 1471 | -287.7 |
| 1472 | -287.8 |
| 1473 | -287.8 |
| 1474 | -288 |
| 1475 | -288.6 |
| 1476 | -288.6 |
| 1477 | -288.6 |
| 1478 | -288.8 |
| 1479 | -288.9 |
| 1480 | -288.9 |
| 1481 | -289 |
| 1482 | -289.1 |
| 1483 | -289.4 |
| 1484 | -289.4 |
| 1485 | -289.4 |
| 1486 | -289.9 |
| 1487 | -289.9 |
| 1488 | -289.9 |
| 1489 | -290 |
| 1490 | -290.1 |
| 1491 | -290.3 |
| 1492 | -290.4 |
| 1493 | -290.5 |
| 1494 | -290.5 |
| 1495 | -290.6 |
| 1496 | -290.6 |
| 1497 | -290.7 |
| 1498 | -290.7 |
| 1499 | -290.8 |
| 1500 | -290.8 |
| 1501 | -290.8 |
| 1502 | -291 |
| 1503 | -291.3 |
| 1504 | -291.3 |
| 1505 | -291.3 |
| 1506 | -291.3 |
| 1507 | -291.4 |
| 1508 | -291.5 |
| 1509 | -291.7 |
| 1510 | -291.8 |
| 1511 | -291.8 |
| 1512 | -292 |
| 1513 | -292 |
| 1514 | -292.1 |
| 1515 | -292.3 |
| 1516 | -292.3 |
| 1517 | -292.7 |
| 1518 | -292.7 |
| 1519 | -292.9 |
| 1520 | -293.1 |
| 1521 | -293.6 |
| 1522 | -293.9 |
| 1523 | -294 |
| 1524 | -294.2 |
| 1525 | -294.8 |
| 1526 | -294.8 |
| 1527 | -295.2 |
| 1528 | -295.3 |
| 1529 | -295.3 |
| 1530 | -295.4 |
| 1531 | -295.4 |
| 1532 | -295.5 |
| 1533 | -295.7 |
| 1534 | -295.8 |
| 1535 | -296 |
| 1536 | -296.2 |
| 1537 | -296.5 |
| 1538 | -296.9 |
| 1539 | -297.2 |
| 1540 | -297.3 |
| 1541 | -297.4 |
| 1542 | -297.4 |
| 1543 | -297.5 |
| 1544 | -297.6 |
| 1545 | -297.6 |
| 1546 | -297.8 |
| 1547 | -297.9 |
| 1548 | -297.9 |
| 1549 | -298 |
| 1550 | -298.4 |
| 1551 | -298.5 |
| 1552 | -298.5 |
| 1553 | -298.6 |
| 1554 | -298.9 |
| 1555 | -299 |
| 1556 | -299 |
| 1557 | -299.1 |
| 1558 | -299.2 |
| 1559 | -299.5 |
| 1560 | -299.5 |
| 1561 | -299.5 |
| 1562 | -299.8 |
| 1563 | -299.8 |
| 1564 | -299.9 |
| 1565 | -300 |
| 1566 | -300.1 |
| 1567 | -300.1 |
| 1568 | -300.2 |
| 1569 | -300.4 |
| 1570 | -300.6 |
| 1571 | -300.7 |
| 1572 | -300.9 |
| 1573 | -301 |
| 1574 | -301.1 |
| 1575 | -301.1 |
| 1576 | -301.3 |
| 1577 | -301.4 |
| 1578 | -301.5 |
| 1579 | -301.5 |
| 1580 | -301.6 |
| 1581 | -301.7 |
| 1582 | -301.7 |
| 1583 | -301.7 |
| 1584 | -301.7 |
| 1585 | -301.8 |
| 1586 | -301.8 |
| 1587 | -301.9 |
| 1588 | -301.9 |
| 1589 | -301.9 |
| 1590 | -301.9 |
| 1591 | -301.9 |
| 1592 | -301.9 |
| 1593 | -301.9 |
| 1594 | -301.9 |
| 1595 | -301.9 |
| 1596 | -302 |
| 1597 | -302 |
| 1598 | -302.1 |
| 1599 | -302.1 |
| 1600 | -302.1 |
| 1601 | -302.2 |
| 1602 | -302.4 |
| 1603 | -302.4 |
| 1604 | -302.5 |
| 1605 | -302.5 |
| 1606 | -302.5 |
| 1607 | -302.6 |
| 1608 | -302.7 |
| 1609 | -302.7 |
| 1610 | -302.8 |
| 1611 | -302.8 |
| 1612 | -302.8 |
| 1613 | -302.8 |
| 1614 | -302.9 |
| 1615 | -302.9 |
| 1616 | -302.9 |
| 1617 | -302.9 |
| 1618 | -303 |
| 1619 | -303 |
| 1620 | -303 |
| 1621 | -303.1 |
| 1622 | -303.4 |
| 1623 | -303.4 |
| 1624 | -303.5 |
| 1625 | -303.5 |
| 1626 | -303.6 |
| 1627 | -304 |
| 1628 | -304 |
| 1629 | -304.1 |
| 1630 | -304.1 |
| 1631 | -304.1 |
| 1632 | -304.2 |
| 1633 | -304.3 |
| 1634 | -304.4 |
| 1635 | -304.5 |
| 1636 | -304.6 |
| 1637 | -304.6 |
| 1638 | -304.6 |
| 1639 | -304.6 |
| 1640 | -304.7 |
| 1641 | -305 |
| 1642 | -305.1 |
| 1643 | -305.1 |
| 1644 | -305.2 |
| 1645 | -305.4 |
| 1646 | -305.4 |
| 1647 | -305.4 |
| 1648 | -305.5 |
| 1649 | -305.5 |
| 1650 | -305.5 |
| 1651 | -305.5 |
| 1652 | -305.5 |
| 1653 | -305.6 |
| 1654 | -305.6 |
| 1655 | -305.6 |
| 1656 | -305.7 |
| 1657 | -305.7 |
| 1658 | -305.7 |
| 1659 | -305.9 |
| 1660 | -305.9 |
| 1661 | -306 |
| 1662 | -306 |
| 1663 | -306 |
| 1664 | -306.2 |
| 1665 | -306.3 |
| 1666 | -306.3 |
| 1667 | -306.3 |
| 1668 | -306.3 |
| 1669 | -306.3 |
| 1670 | -306.4 |
| 1671 | -306.5 |
| 1672 | -306.6 |
| 1673 | -306.7 |
| 1674 | -307 |
| 1675 | -307 |
| 1676 | -307.3 |
| 1677 | -307.4 |
| 1678 | -307.4 |
| 1679 | -307.4 |
| 1680 | -307.5 |
| 1681 | -307.7 |
| 1682 | -307.7 |
| 1683 | -307.7 |
| 1684 | -307.7 |
| 1685 | -307.8 |
| 1686 | -307.8 |
| 1687 | -307.8 |
| 1688 | -307.8 |
| 1689 | -307.8 |
| 1690 | -307.9 |
| 1691 | -307.9 |
| 1692 | -307.9 |
| 1693 | -307.9 |
| 1694 | -308.2 |
| 1695 | -308.2 |
| 1696 | -308.3 |
| 1697 | -308.3 |
| 1698 | -308.4 |
| 1699 | -308.5 |
| 1700 | -308.7 |
| 1701 | -308.8 |
| 1702 | -308.9 |
| 1703 | -309 |
| 1704 | -309.1 |
| 1705 | -309.1 |
| 1706 | -309.3 |
| 1707 | -309.4 |
| 1708 | -309.4 |
| 1709 | -309.4 |
| 1710 | -309.4 |
| 1711 | -309.5 |
| 1712 | -309.5 |
| 1713 | -309.5 |
| 1714 | -309.6 |
| 1715 | -309.7 |
| 1716 | -309.7 |
| 1717 | -309.7 |
| 1718 | -309.7 |
| 1719 | -309.8 |
| 1720 | -309.8 |
| 1721 | -309.9 |
| 1722 | -309.9 |
| 1723 | -310 |
| 1724 | -310 |
| 1725 | -310.1 |
| 1726 | -310.1 |
| 1727 | -310.2 |
| 1728 | -310.2 |
| 1729 | -310.3 |
| 1730 | -310.4 |
| 1731 | -310.5 |
| 1732 | -310.5 |
| 1733 | -310.6 |
| 1734 | -310.6 |
| 1735 | -310.6 |
| 1736 | -310.6 |
| 1737 | -310.6 |
| 1738 | -310.7 |
| 1739 | -310.8 |
| 1740 | -310.9 |
| 1741 | -311 |
| 1742 | -311 |
| 1743 | -311 |
| 1744 | -311.1 |
| 1745 | -311.2 |
| 1746 | -311.3 |
| 1747 | -311.4 |
| 1748 | -311.4 |
| 1749 | -311.5 |
| 1750 | -311.6 |
| 1751 | -311.6 |
| 1752 | -311.6 |
| 1753 | -311.8 |
| 1754 | -311.8 |
| 1755 | -311.9 |
| 1756 | -311.9 |
| 1757 | -311.9 |
| 1758 | -312 |
| 1759 | -312.2 |
| 1760 | -312.2 |
| 1761 | -312.2 |
| 1762 | -312.2 |
| 1763 | -312.3 |
| 1764 | -312.5 |
| 1765 | -312.5 |
| 1766 | -312.5 |
| 1767 | -312.5 |
| 1768 | -312.6 |
| 1769 | -312.6 |
| 1770 | -312.6 |
| 1771 | -312.6 |
| 1772 | -312.8 |
| 1773 | -312.8 |
| 1774 | -312.8 |
| 1775 | -312.9 |
| 1776 | -313 |
| 1777 | -313 |
| 1778 | -313 |
| 1779 | -313 |
| 1780 | -313.1 |
| 1781 | -313.1 |
| 1782 | -313.2 |
| 1783 | -313.2 |
| 1784 | -313.2 |
| 1785 | -313.2 |
| 1786 | -313.2 |
| 1787 | -313.3 |
| 1788 | -313.3 |
| 1789 | -313.3 |
| 1790 | -313.7 |
| 1791 | -313.8 |
| 1792 | -313.8 |
| 1793 | -313.8 |
| 1794 | -313.9 |
| 1795 | -313.9 |
| 1796 | -314 |
| 1797 | -314.1 |
| 1798 | -314.1 |
| 1799 | -314.1 |
| 1800 | -314.1 |
| 1801 | -314.2 |
| 1802 | -314.2 |
| 1803 | -314.2 |
| 1804 | -314.2 |
| 1805 | -314.2 |
| 1806 | -314.3 |
| 1807 | -314.3 |
| 1808 | -314.3 |
| 1809 | -314.4 |
| 1810 | -314.4 |
| 1811 | -314.4 |
| 1812 | -314.4 |
| 1813 | -314.4 |
| 1814 | -314.5 |
| 1815 | -314.5 |
| 1816 | -314.5 |
| 1817 | -314.5 |
| 1818 | -314.6 |
| 1819 | -314.7 |
| 1820 | -314.7 |
| 1821 | -314.7 |
| 1822 | -314.7 |
| 1823 | -314.7 |
| 1824 | -314.7 |
| 1825 | -314.7 |
| 1826 | -314.8 |
| 1827 | -314.9 |
| 1828 | -314.9 |
| 1829 | -314.9 |
| 1830 | -314.9 |
| 1831 | -314.9 |
| 1832 | -315 |
| 1833 | -315.1 |
| 1834 | -315.2 |
| 1835 | -315.2 |
| 1836 | -315.2 |
| 1837 | -315.2 |
| 1838 | -315.2 |
| 1839 | -315.2 |
| 1840 | -315.3 |
| 1841 | -315.4 |
| 1842 | -315.4 |
| 1843 | -315.4 |
| 1844 | -315.6 |
| 1845 | -315.7 |
| 1846 | -315.7 |
| 1847 | -315.7 |
| 1848 | -315.7 |
| 1849 | -315.8 |
| 1850 | -315.9 |
| 1851 | -315.9 |
| 1852 | -316 |
| 1853 | -316 |
| 1854 | -316 |
| 1855 | -316 |
| 1856 | -316 |
| 1857 | -316.1 |
| 1858 | -316.1 |
| 1859 | -316.1 |
| 1860 | -316.1 |
| 1861 | -316.1 |
| 1862 | -316.2 |
| 1863 | -316.2 |
| 1864 | -316.2 |
| 1865 | -316.2 |
| 1866 | -316.2 |
| 1867 | -316.2 |
| 1868 | -316.3 |
| 1869 | -316.3 |
| 1870 | -316.3 |
| 1871 | -316.5 |
| 1872 | -316.5 |
| 1873 | -316.6 |
| 1874 | -316.7 |
| 1875 | -316.9 |
| 1876 | -317 |
| 1877 | -317 |
| 1878 | -317.1 |
| 1879 | -317.1 |
| 1880 | -317.2 |
| 1881 | -317.4 |
| 1882 | -317.5 |
| 1883 | -317.5 |
| 1884 | -317.6 |
| 1885 | -317.6 |
| 1886 | -317.7 |
| 1887 | -317.7 |
| 1888 | -317.7 |
| 1889 | -317.7 |
| 1890 | -317.8 |
| 1891 | -317.8 |
| 1892 | -317.8 |
| 1893 | -317.9 |
| 1894 | -317.9 |
| 1895 | -317.9 |
| 1896 | -317.9 |
| 1897 | -318 |
| 1898 | -318.1 |
| 1899 | -318.2 |
| 1900 | -318.3 |
| 1901 | -318.3 |
| 1902 | -318.3 |
| 1903 | -318.4 |
| 1904 | -318.5 |
| 1905 | -318.5 |
| 1906 | -318.5 |
| 1907 | -318.5 |
| 1908 | -318.5 |
| 1909 | -318.6 |
| 1910 | -318.6 |
| 1911 | -318.8 |
| 1912 | -318.9 |
| 1913 | -318.9 |
| 1914 | -319.1 |
| 1915 | -319.2 |
| 1916 | -319.3 |
| 1917 | -319.3 |
| 1918 | -319.3 |
| 1919 | -319.3 |
| 1920 | -319.4 |
| 1921 | -319.4 |
| 1922 | -319.4 |
| 1923 | -319.5 |
| 1924 | -319.5 |
| 1925 | -319.6 |
| 1926 | -319.6 |
| 1927 | -319.7 |
| 1928 | -319.7 |
| 1929 | -319.7 |
| 1930 | -319.7 |
| 1931 | -319.7 |
| 1932 | -319.7 |
| 1933 | -319.7 |
| 1934 | -319.7 |
| 1935 | -319.9 |
| 1936 | -319.9 |
| 1937 | -319.9 |
| 1938 | -319.9 |
| 1939 | -320 |
| 1940 | -320 |
| 1941 | -320 |
| 1942 | -320 |
| 1943 | -320.1 |
| 1944 | -320.1 |
| 1945 | -320.1 |
| 1946 | -320.1 |
| 1947 | -320.1 |
| 1948 | -320.2 |
| 1949 | -320.2 |
| 1950 | -320.2 |
| 1951 | -320.2 |
| 1952 | -320.3 |
| 1953 | -320.3 |
| 1954 | -320.3 |
| 1955 | -320.3 |
| 1956 | -320.3 |
| 1957 | -320.4 |
| 1958 | -320.4 |
| 1959 | -320.4 |
| 1960 | -320.4 |
| 1961 | -320.4 |
| 1962 | -320.5 |
| 1963 | -320.5 |
| 1964 | -320.5 |
| 1965 | -320.5 |
| 1966 | -320.6 |
| 1967 | -320.6 |
| 1968 | -320.7 |
| 1969 | -320.7 |
| 1970 | -320.7 |
| 1971 | -320.7 |
| 1972 | -320.8 |
| 1973 | -320.9 |
| 1974 | -320.9 |
| 1975 | -320.9 |
| 1976 | -320.9 |
| 1977 | -321 |
| 1978 | -321 |
| 1979 | -321 |
| 1980 | -321 |
| 1981 | -321.1 |
| 1982 | -321.1 |
| 1983 | -321.1 |
| 1984 | -321.1 |
| 1985 | -321.1 |
| 1986 | -321.1 |
| 1987 | -321.1 |
| 1988 | -321.1 |
| 1989 | -321.2 |
| 1990 | -321.2 |
| 1991 | -321.2 |
| 1992 | -321.2 |
| 1993 | -321.3 |
| 1994 | -321.3 |
| 1995 | -321.3 |
| 1996 | -321.3 |
| 1997 | -321.3 |
| 1998 | -321.4 |
| 1999 | -321.4 |
| 2000 | -321.5 |
| 2001 | -321.5 |
| 2002 | -321.5 |
| 2003 | -321.6 |
| 2004 | -321.6 |
| 2005 | -321.6 |
| 2006 | -321.7 |
| 2007 | -321.7 |
| 2008 | -321.7 |
| 2009 | -321.7 |
| 2010 | -321.7 |
| 2011 | -321.7 |
| 2012 | -321.7 |
| 2013 | -321.8 |
| 2014 | -321.8 |
| 2015 | -321.8 |
| 2016 | -321.8 |
| 2017 | -321.8 |
| 2018 | -321.8 |
| 2019 | -321.9 |
| 2020 | -321.9 |
| 2021 | -322 |
| 2022 | -322.1 |
| 2023 | -322.1 |
| 2024 | -322.1 |
| 2025 | -322.2 |
| 2026 | -322.2 |
| 2027 | -322.2 |
| 2028 | -322.2 |
| 2029 | -322.2 |
| 2030 | -322.2 |
| 2031 | -322.2 |
| 2032 | -322.2 |
| 2033 | -322.2 |
| 2034 | -322.2 |
| 2035 | -322.2 |
| 2036 | -322.3 |
| 2037 | -322.3 |
| 2038 | -322.4 |
| 2039 | -322.4 |
| 2040 | -322.4 |
| 2041 | -322.5 |
| 2042 | -322.5 |
| 2043 | -322.5 |
| 2044 | -322.5 |
| 2045 | -322.5 |
| 2046 | -322.5 |
| 2047 | -322.5 |
| 2048 | -322.6 |
| 2049 | -322.6 |
| 2050 | -322.6 |
| 2051 | -322.6 |
| 2052 | -322.6 |
| 2053 | -322.6 |
| 2054 | -322.7 |
| 2055 | -322.7 |
| 2056 | -322.7 |
| 2057 | -322.7 |
| 2058 | -322.7 |
| 2059 | -322.7 |
| 2060 | -322.8 |
| 2061 | -322.8 |
| 2062 | -322.8 |
| 2063 | -322.8 |
| 2064 | -322.9 |
| 2065 | -322.9 |
| 2066 | -322.9 |
| 2067 | -322.9 |
| 2068 | -322.9 |
| 2069 | -323 |
| 2070 | -323 |
| 2071 | -323 |
| 2072 | -323 |
| 2073 | -323 |
| 2074 | -323 |
| 2075 | -323.1 |
| 2076 | -323.1 |
| 2077 | -323.1 |
| 2078 | -323.1 |
| 2079 | -323.1 |
| 2080 | -323.2 |
| 2081 | -323.2 |
| 2082 | -323.2 |
| 2083 | -323.2 |
| 2084 | -323.3 |
| 2085 | -323.3 |
| 2086 | -323.3 |
| 2087 | -323.3 |
| 2088 | -323.3 |
| 2089 | -323.3 |
| 2090 | -323.4 |
| 2091 | -323.4 |
| 2092 | -323.4 |
| 2093 | -323.4 |
| 2094 | -323.4 |
| 2095 | -323.4 |
| 2096 | -323.4 |
| 2097 | -323.5 |
| 2098 | -323.5 |
| 2099 | -323.5 |
| 2100 | -323.5 |
| 2101 | -323.5 |
| 2102 | -323.5 |
| 2103 | -323.5 |
| 2104 | -323.5 |
| 2105 | -323.5 |
| 2106 | -323.5 |
| 2107 | -323.6 |
| 2108 | -323.6 |
| 2109 | -323.6 |
| 2110 | -323.6 |
| 2111 | -323.6 |
| 2112 | -323.6 |
| 2113 | -323.7 |
| 2114 | -323.7 |
| 2115 | -323.7 |
| 2116 | -323.7 |
| 2117 | -323.7 |
| 2118 | -323.8 |
| 2119 | -323.8 |
| 2120 | -323.8 |
| 2121 | -323.8 |
| 2122 | -323.8 |
| 2123 | -323.8 |
| 2124 | -323.8 |
| 2125 | -323.9 |
| 2126 | -323.9 |
| 2127 | -323.9 |
| 2128 | -323.9 |
| 2129 | -323.9 |
| 2130 | -323.9 |
| 2131 | -323.9 |
| 2132 | -323.9 |
| 2133 | -323.9 |
| 2134 | -323.9 |
| 2135 | -324 |
| 2136 | -324 |
| 2137 | -324 |
| 2138 | -324 |
| 2139 | -324 |
| 2140 | -324.1 |
| 2141 | -324.1 |
| 2142 | -324.1 |
| 2143 | -324.1 |
| 2144 | -324.1 |
| 2145 | -324.1 |
| 2146 | -324.1 |
| 2147 | -324.1 |
| 2148 | -324.1 |
| 2149 | -324.2 |
| 2150 | -324.2 |
| 2151 | -324.2 |
| 2152 | -324.2 |
| 2153 | -324.2 |
| 2154 | -324.2 |
| 2155 | -324.3 |
| 2156 | -324.3 |
| 2157 | -324.3 |
| 2158 | -324.4 |
| 2159 | -324.4 |
| 2160 | -324.4 |
| 2161 | -324.4 |
| 2162 | -324.5 |
| 2163 | -324.5 |
| 2164 | -324.5 |
| 2165 | -324.5 |
| 2166 | -324.5 |
| 2167 | -324.6 |
| 2168 | -324.6 |
| 2169 | -324.6 |
| 2170 | -324.6 |
| 2171 | -324.6 |
| 2172 | -324.6 |
| 2173 | -324.6 |
| 2174 | -324.6 |
| 2175 | -324.6 |
| 2176 | -324.6 |
| 2177 | -324.6 |
| 2178 | -324.6 |
| 2179 | -324.6 |
| 2180 | -324.6 |
| 2181 | -324.6 |
| 2182 | -324.6 |
| 2183 | -324.6 |
| 2184 | -324.6 |
| 2185 | -324.6 |
| 2186 | -324.7 |
| 2187 | -324.7 |
| 2188 | -324.7 |
| 2189 | -324.7 |
| 2190 | -324.7 |
| 2191 | -324.7 |
| 2192 | -324.8 |
| 2193 | -324.8 |
| 2194 | -324.8 |
| 2195 | -324.8 |
| 2196 | -324.8 |
| 2197 | -324.8 |
| 2198 | -324.8 |
| 2199 | -324.8 |
| 2200 | -324.8 |
| 2201 | -324.8 |
| 2202 | -324.8 |
| 2203 | -324.9 |
| 2204 | -324.9 |
| 2205 | -324.9 |
| 2206 | -324.9 |
| 2207 | -324.9 |
| 2208 | -324.9 |
| 2209 | -324.9 |
| 2210 | -324.9 |
| 2211 | -324.9 |
| 2212 | -324.9 |
| 2213 | -324.9 |
| 2214 | -324.9 |
| 2215 | -324.9 |
| 2216 | -324.9 |
| 2217 | -324.9 |
| 2218 | -324.9 |
| 2219 | -324.9 |
| 2220 | -324.9 |
| 2221 | -324.9 |
| 2222 | -324.9 |
| 2223 | -324.9 |
| 2224 | -324.9 |
| 2225 | -324.9 |
| 2226 | -324.9 |
| 2227 | -324.9 |
| 2228 | -324.9 |
| 2229 | -324.9 |
| 2230 | -324.9 |
| 2231 | -324.9 |
| 2232 | -324.9 |
| 2233 | -324.9 |
| 2234 | -324.9 |
| 2235 | -324.9 |
| 2236 | -324.9 |
| 2237 | -324.9 |
| 2238 | -324.9 |
| 2239 | -324.9 |
| 2240 | -324.9 |
| 2241 | -324.9 |
| 2242 | -324.9 |
| 2243 | -324.9 |
| 2244 | -324.9 |
| 2245 | -324.9 |
| 2246 | -324.9 |
| 2247 | -324.9 |
| 2248 | -324.9 |
| 2249 | -324.9 |
| 2250 | -324.9 |
| 2251 | -324.9 |
| 2252 | -324.9 |
| 2253 | -324.9 |
| 2254 | -324.9 |
| 2255 | -324.9 |
| 2256 | -324.9 |
| 2257 | -325 |
| 2258 | -325 |
| 2259 | -325 |
| 2260 | -325 |
| 2261 | -325 |
| 2262 | -325 |
| 2263 | -325.1 |
| 2264 | -325.1 |
| 2265 | -325.1 |
| 2266 | -325.1 |
| 2267 | -325.1 |
| 2268 | -325.1 |
| 2269 | -325.1 |
| 2270 | -325.1 |
| 2271 | -325.1 |
| 2272 | -325.1 |
| 2273 | -325.1 |
| 2274 | -325.1 |
| 2275 | -325.1 |
| 2276 | -325.1 |
| 2277 | -325.1 |
| 2278 | -325.1 |
| 2279 | -325.1 |
| 2280 | -325.1 |
| 2281 | -325.1 |
| 2282 | -325.2 |
| 2283 | -325.2 |
| 2284 | -325.2 |
| 2285 | -325.2 |
| 2286 | -325.3 |
| 2287 | -325.3 |
| 2288 | -325.3 |
| 2289 | -325.3 |
| 2290 | -325.3 |
| 2291 | -325.3 |
| 2292 | -325.3 |
| 2293 | -325.3 |
| 2294 | -325.3 |
| 2295 | -325.3 |
| 2296 | -325.3 |
| 2297 | -325.3 |
| 2298 | -325.3 |
| 2299 | -325.3 |
| 2300 | -325.3 |
| 2301 | -325.3 |
| 2302 | -325.3 |
| 2303 | -325.3 |
| 2304 | -325.3 |
| 2305 | -325.3 |
| 2306 | -325.3 |
| 2307 | -325.3 |
| 2308 | -325.3 |
| 2309 | -325.3 |
| 2310 | -325.4 |
| 2311 | -325.4 |
| 2312 | -325.4 |
| 2313 | -325.4 |
| 2314 | -325.5 |
| 2315 | -325.5 |
| 2316 | -325.5 |
| 2317 | -325.5 |
| 2318 | -325.5 |
| 2319 | -325.5 |
| 2320 | -325.5 |
| 2321 | -325.5 |
| 2322 | -325.5 |
| 2323 | -325.6 |
| 2324 | -325.6 |
| 2325 | -325.6 |
| 2326 | -325.6 |
| 2327 | -325.6 |
| 2328 | -325.6 |
| 2329 | -325.6 |
| 2330 | -325.6 |
| 2331 | -325.6 |
| 2332 | -325.6 |
| 2333 | -325.6 |
| 2334 | -325.6 |
| 2335 | -325.6 |
| 2336 | -325.6 |
| 2337 | -325.6 |
| 2338 | -325.6 |
| 2339 | -325.6 |
| 2340 | -325.6 |
| 2341 | -325.6 |
| 2342 | -325.6 |
| 2343 | -325.6 |
| 2344 | -325.6 |
| 2345 | -325.6 |
| 2346 | -325.6 |
| 2347 | -325.6 |
| 2348 | -325.6 |
| 2349 | -325.6 |
| 2350 | -325.6 |
| 2351 | -325.6 |
| 2352 | -325.6 |
| 2353 | -325.6 |
| 2354 | -325.6 |
| 2355 | -325.6 |
| 2356 | -325.6 |
| 2357 | -325.6 |
| 2358 | -325.6 |
| 2359 | -325.6 |
| 2360 | -325.6 |
| 2361 | -325.6 |
| 2362 | -325.6 |
| 2363 | -325.6 |
| 2364 | -325.6 |
| 2365 | -325.6 |
| 2366 | -325.6 |
| 2367 | -325.6 |
| 2368 | -325.6 |
| 2369 | -325.6 |
| 2370 | -325.6 |
| 2371 | -325.6 |
| 2372 | -325.6 |
| 2373 | -325.6 |
| 2374 | -325.6 |
| 2375 | -325.6 |
| 2376 | -325.6 |
| 2377 | -325.7 |
| 2378 | -325.7 |
| 2379 | -325.7 |
| 2380 | -325.7 |
| 2381 | -325.7 |
| 2382 | -325.7 |
| 2383 | -325.7 |
| 2384 | -325.7 |
| 2385 | -325.7 |
| 2386 | -325.7 |
| 2387 | -325.7 |
| 2388 | -325.7 |
| 2389 | -325.7 |
| 2390 | -325.7 |
| 2391 | -325.7 |
| 2392 | -325.7 |
| 2393 | -325.7 |
| 2394 | -325.7 |
| 2395 | -325.7 |
| 2396 | -325.7 |
| 2397 | -325.7 |
| 2398 | -325.7 |
| 2399 | -325.7 |
| 2400 | -325.7 |
| 2401 | -325.7 |
| 2402 | -325.7 |
| 2403 | -325.7 |
| 2404 | -325.7 |
| 2405 | -325.7 |
| 2406 | -325.7 |
| 2407 | -325.7 |
| 2408 | -325.7 |
| 2409 | -325.8 |
| 2410 | -325.8 |
| 2411 | -325.8 |
| 2412 | -325.8 |
| 2413 | -325.8 |
| 2414 | -325.8 |
| 2415 | -325.8 |
| 2416 | -325.9 |
| 2417 | -325.9 |
| 2418 | -325.9 |
| 2419 | -325.9 |
| 2420 | -325.9 |
| 2421 | -325.9 |
| 2422 | -325.9 |
| 2423 | -325.9 |
| 2424 | -325.9 |
| 2425 | -325.9 |
| 2426 | -325.9 |
| 2427 | -325.9 |
| 2428 | -325.9 |
| 2429 | -326 |
| 2430 | -326 |
| 2431 | -326 |
| 2432 | -326 |
| 2433 | -326 |
| 2434 | -326 |
| 2435 | -326 |
| 2436 | -326 |
| 2437 | -326.1 |
| 2438 | -326.1 |
| 2439 | -326.1 |
| 2440 | -326.2 |
| 2441 | -326.2 |
| 2442 | -326.2 |
| 2443 | -326.2 |
| 2444 | -326.2 |
| 2445 | -326.3 |
| 2446 | -326.3 |